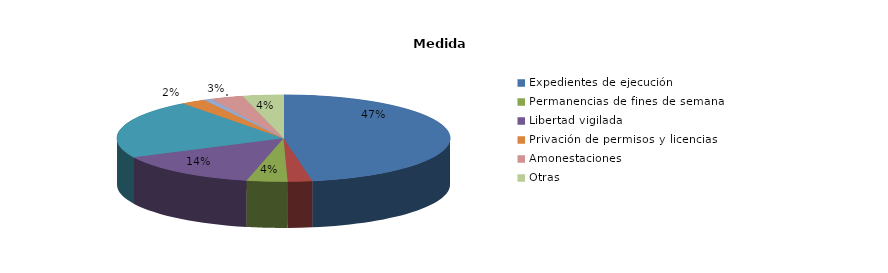
| Category | Series 0 |
|---|---|
| Expedientes de ejecución | 60 |
| Internamientos | 3 |
| Permanencias de fines de semana | 5 |
| Libertad vigilada | 18 |
| Prestaciones en beneficio de la comunidad | 28 |
| Privación de permisos y licencias | 3 |
| Convivencia Familiar Educativa | 1 |
| Amonestaciones | 4 |
| Otras | 5 |